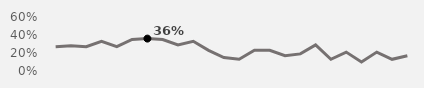
| Category | Sunday |
|---|---|
| 1994.0 | 0.27 |
| 1995.0 | 0.28 |
| 1996.0 | 0.27 |
| 1997.0 | 0.33 |
| 1998.0 | 0.27 |
| 1999.0 | 0.35 |
| 2000.0 | 0.36 |
| 2001.0 | 0.35 |
| 2002.0 | 0.29 |
| 2003.0 | 0.33 |
| 2004.0 | 0.23 |
| 2005.0 | 0.15 |
| 2006.0 | 0.13 |
| 2007.0 | 0.23 |
| 2008.0 | 0.23 |
| 2009.0 | 0.17 |
| 2010.0 | 0.19 |
| 2011.0 | 0.29 |
| 2012.0 | 0.13 |
| 2013.0 | 0.21 |
| 2014.0 | 0.1 |
| 2015.0 | 0.21 |
| 2016.0 | 0.13 |
| 2017.0 | 0.17 |